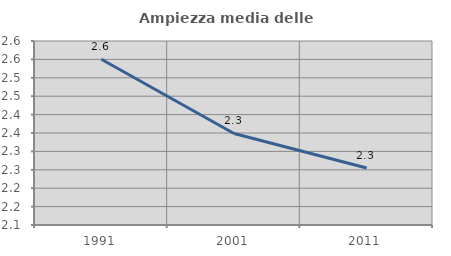
| Category | Ampiezza media delle famiglie |
|---|---|
| 1991.0 | 2.55 |
| 2001.0 | 2.349 |
| 2011.0 | 2.255 |